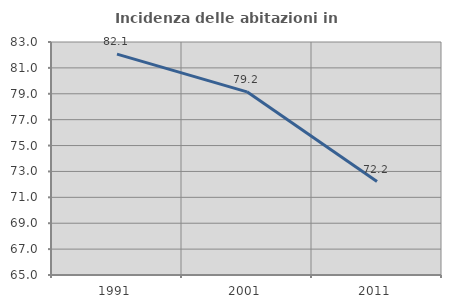
| Category | Incidenza delle abitazioni in proprietà  |
|---|---|
| 1991.0 | 82.061 |
| 2001.0 | 79.151 |
| 2011.0 | 72.222 |